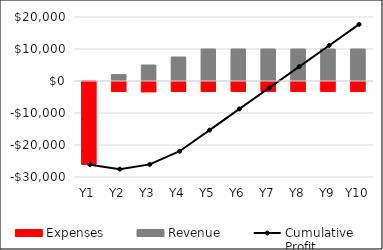
| Category | Expenses | Revenue |
|---|---|---|
| Y1 | -26140 | 0 |
| Y2 | -3410 | 2000 |
| Y3 | -3510 | 5000 |
| Y4 | -3390 | 7500 |
| Y5 | -3390 | 10000 |
| Y6 | -3390 | 10000 |
| Y7 | -3390 | 10000 |
| Y8 | -3390 | 10000 |
| Y9 | -3390 | 10000 |
| Y10 | -3390 | 10000 |